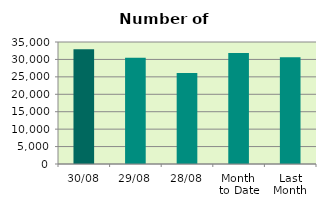
| Category | Series 0 |
|---|---|
| 30/08 | 32952 |
| 29/08 | 30510 |
| 28/08 | 26118 |
| Month 
to Date | 31813.182 |
| Last
Month | 30613.13 |